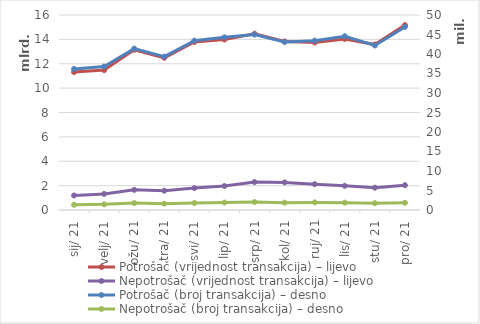
| Category | Potrošač (vrijednost transakcija) – lijevo | Nepotrošač (vrijednost transakcija) – lijevo |
|---|---|---|
| 2021-01-01 | 11317985173 | 1191051791 |
| 2021-02-01 | 11478749607 | 1319822182 |
| 2021-03-01 | 13145990264 | 1655349951 |
| 2021-04-01 | 12486776990 | 1583530269 |
| 2021-05-01 | 13787537064 | 1797539619 |
| 2021-06-01 | 13990990559 | 1968935496 |
| 2021-07-01 | 14465513150 | 2290869216 |
| 2021-08-01 | 13828999134 | 2265112784 |
| 2021-09-01 | 13744363759 | 2120480773 |
| 2021-10-01 | 14035590688 | 1981651999 |
| 2021-11-01 | 13575745737 | 1828971620 |
| 2021-12-01 | 15171955373 | 2035927798 |